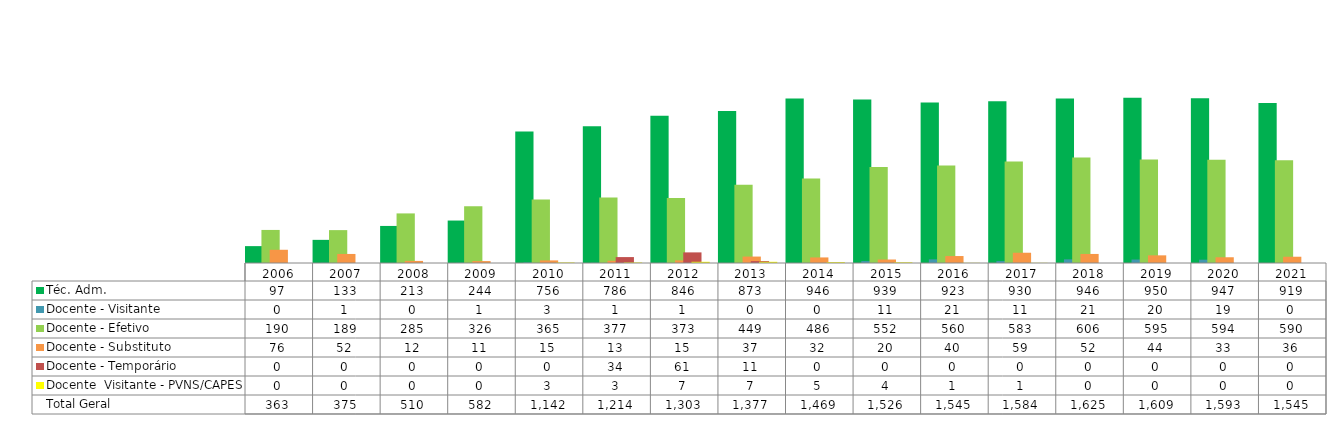
| Category | Téc. Adm. | Docente - Visitante | Docente - Efetivo | Docente - Substituto | Docente - Temporário | Docente  Visitante - PVNS/CAPES | Total Geral |
|---|---|---|---|---|---|---|---|
| 2006.0 | 97 | 0 | 190 | 76 | 0 | 0 | 363 |
| 2007.0 | 133 | 1 | 189 | 52 | 0 | 0 | 375 |
| 2008.0 | 213 | 0 | 285 | 12 | 0 | 0 | 510 |
| 2009.0 | 244 | 1 | 326 | 11 | 0 | 0 | 582 |
| 2010.0 | 756 | 3 | 365 | 15 | 0 | 3 | 1142 |
| 2011.0 | 786 | 1 | 377 | 13 | 34 | 3 | 1214 |
| 2012.0 | 846 | 1 | 373 | 15 | 61 | 7 | 1303 |
| 2013.0 | 873 | 0 | 449 | 37 | 11 | 7 | 1377 |
| 2014.0 | 946 | 0 | 486 | 32 | 0 | 5 | 1469 |
| 2015.0 | 939 | 11 | 552 | 20 | 0 | 4 | 1526 |
| 2016.0 | 923 | 21 | 560 | 40 | 0 | 1 | 1545 |
| 2017.0 | 930 | 11 | 583 | 59 | 0 | 1 | 1584 |
| 2018.0 | 946 | 21 | 606 | 52 | 0 | 0 | 1625 |
| 2019.0 | 950 | 20 | 595 | 44 | 0 | 0 | 1609 |
| 2020.0 | 947 | 19 | 594 | 33 | 0 | 0 | 1593 |
| 2021.0 | 919 | 0 | 590 | 36 | 0 | 0 | 1545 |